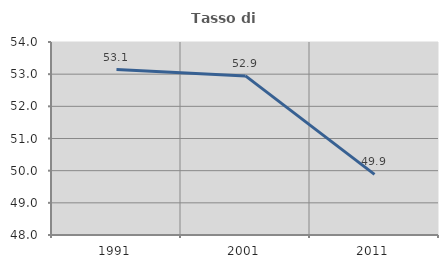
| Category | Tasso di occupazione   |
|---|---|
| 1991.0 | 53.144 |
| 2001.0 | 52.946 |
| 2011.0 | 49.885 |